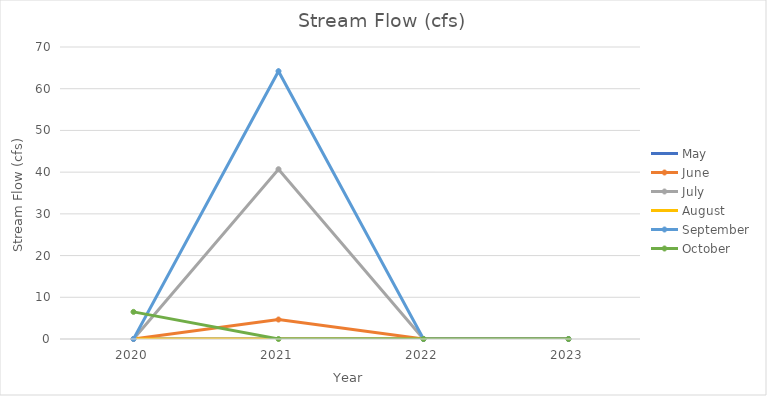
| Category | May | June | July | August | September | October |
|---|---|---|---|---|---|---|
| 2020.0 | 0 | 0 | 0 | 0 | 0 | 6.5 |
| 2021.0 | 0 | 4.67 | 40.7 | 0 | 64.2 | 0 |
| 2022.0 | 0 | 0 | 0 | 0 | 0 | 0 |
| 2023.0 | 0 | 0 | 0 | 0 | 0 | 0 |